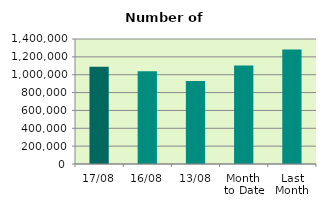
| Category | Series 0 |
|---|---|
| 17/08 | 1088302 |
| 16/08 | 1037768 |
| 13/08 | 930188 |
| Month 
to Date | 1104247.5 |
| Last
Month | 1281605.545 |